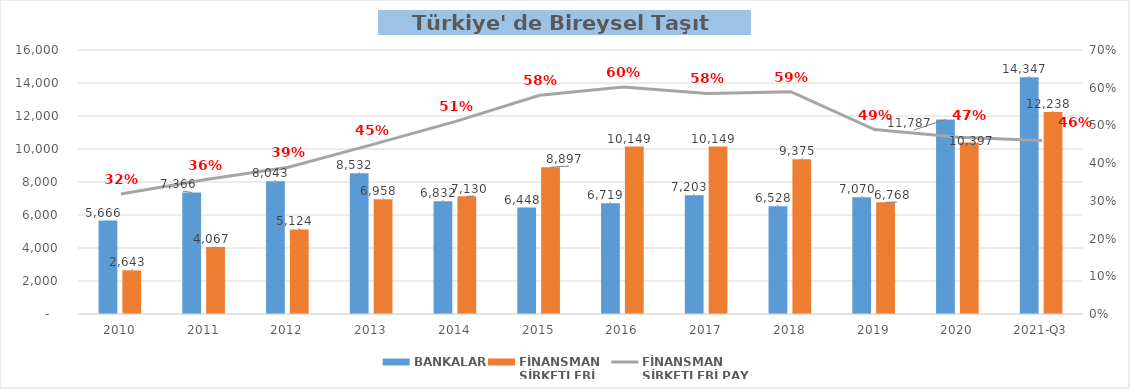
| Category | BANKALAR | FİNANSMAN 
ŞİRKETLERİ |
|---|---|---|
| 2010 | 5665.615 | 2643.169 |
| 2011 | 7366.42 | 4066.867 |
| 2012 | 8042.797 | 5124.261 |
| 2013 | 8531.566 | 6958.23 |
| 2014 | 6832.186 | 7129.957 |
| 2015 | 6447.808 | 8897.137 |
| 2016 | 6719.498 | 10148.982 |
| 2017 | 7202.608 | 10148.903 |
| 2018 | 6528.18 | 9375.099 |
| 2019 | 7070.3 | 6767.535 |
| 2020 | 11786.807 | 10397.228 |
| 2021-Q3 | 14347.348 | 12237.665 |